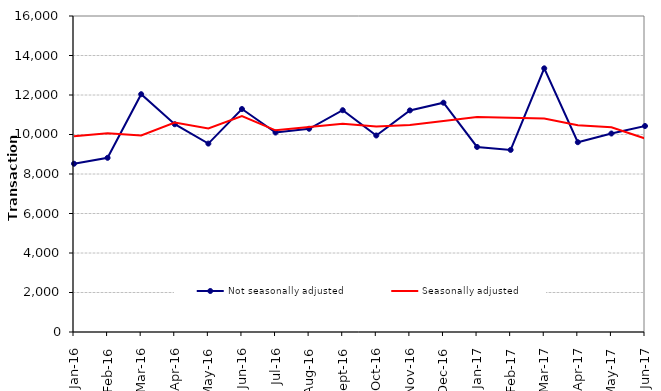
| Category | Not seasonally adjusted | Seasonally adjusted |
|---|---|---|
| 2016-01-01 | 8520 | 9910 |
| 2016-02-01 | 8820 | 10060 |
| 2016-03-01 | 12040 | 9950 |
| 2016-04-01 | 10520 | 10610 |
| 2016-05-01 | 9540 | 10310 |
| 2016-06-01 | 11290 | 10930 |
| 2016-07-01 | 10100 | 10210 |
| 2016-08-01 | 10290 | 10380 |
| 2016-09-01 | 11230 | 10550 |
| 2016-10-01 | 9950 | 10410 |
| 2016-11-01 | 11220 | 10480 |
| 2016-12-01 | 11610 | 10680 |
| 2017-01-01 | 9370 | 10880 |
| 2017-02-01 | 9220 | 10850 |
| 2017-03-01 | 13350 | 10810 |
| 2017-04-01 | 9610 | 10470 |
| 2017-05-01 | 10050 | 10370 |
| 2017-06-01 | 10430 | 9800 |